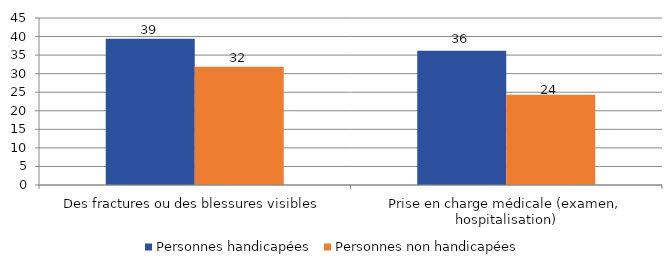
| Category | Personnes handicapées | Personnes non handicapées |
|---|---|---|
| Des fractures ou des blessures visibles | 39.434 | 31.884 |
| Prise en charge médicale (examen, hospitalisation) | 36.191 | 24.297 |